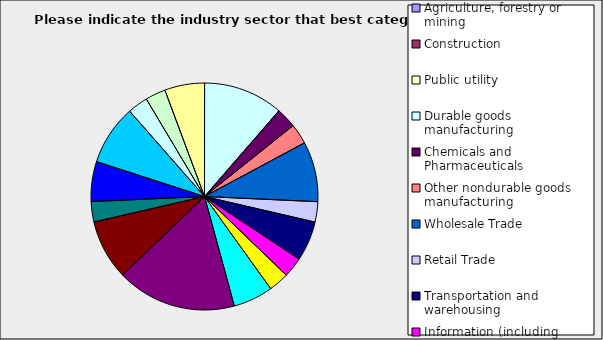
| Category | Series 0 |
|---|---|
| Agriculture, forestry or mining | 0 |
| Construction | 0 |
| Public utility | 0 |
| Durable goods manufacturing | 0.114 |
| Chemicals and Pharmaceuticals | 0.029 |
| Other nondurable goods manufacturing | 0.029 |
| Wholesale Trade | 0.086 |
| Retail Trade | 0.029 |
| Transportation and warehousing | 0.057 |
| Information (including broadcasting and telecommunication) | 0.029 |
| Finance and Insurance | 0.029 |
| Real Estate | 0.057 |
| Professional, scientific and technical services | 0.171 |
| Consulting | 0.086 |
| Administrative and office services (including waste management) | 0.029 |
| Education | 0.057 |
| Health Care and social services | 0.086 |
| Arts, entertainment and recreation | 0.029 |
| Accommodation and food services | 0.029 |
| Other | 0.057 |